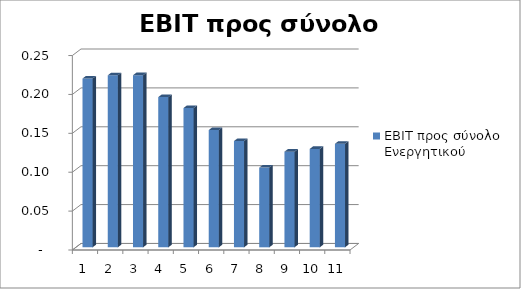
| Category | EBIT προς σύνολο Ενεργητικού |
|---|---|
| 0 | 0.217 |
| 1 | 0.221 |
| 2 | 0.221 |
| 3 | 0.193 |
| 4 | 0.179 |
| 5 | 0.151 |
| 6 | 0.137 |
| 7 | 0.102 |
| 8 | 0.123 |
| 9 | 0.127 |
| 10 | 0.133 |